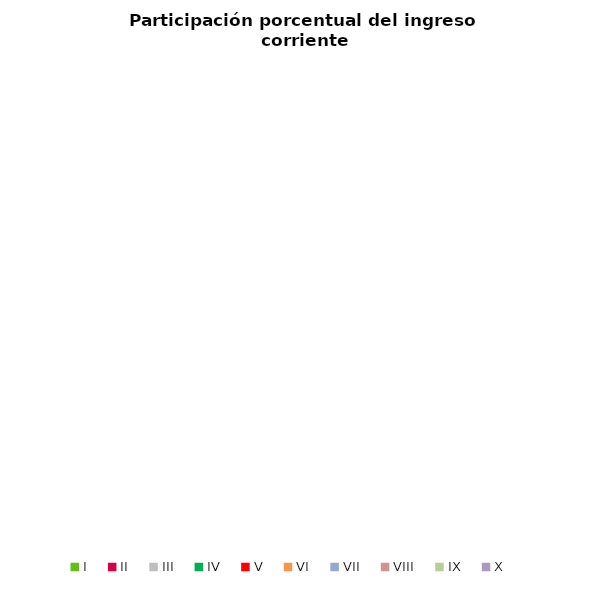
| Category | Series 0 |
|---|---|
| I | 2.423 |
| II | 3.844 |
| III | 4.812 |
| IV | 5.765 |
| V | 6.838 |
| VI | 8.019 |
| VII | 9.607 |
| VIII | 11.772 |
| IX | 15.719 |
| X | 31.201 |